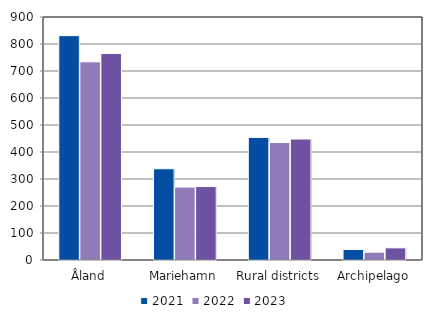
| Category | 2021 | 2022 | 2023 |
|---|---|---|---|
| Åland | 831 | 734 | 765 |
| Mariehamn | 338 | 270 | 272 |
| Rural districts | 454 | 435 | 448 |
| Archipelago | 39 | 29 | 45 |